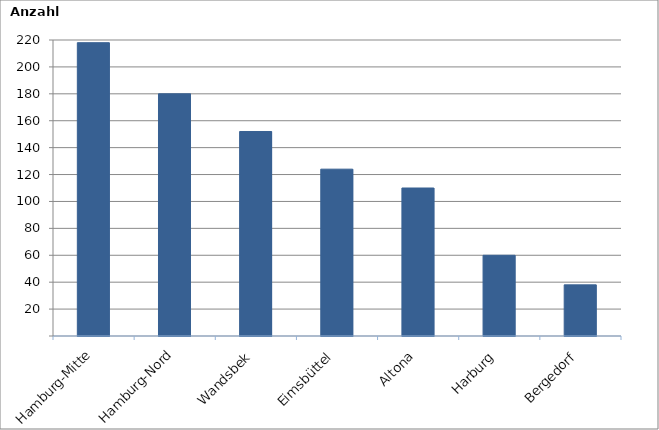
| Category | Series 0 |
|---|---|
| Hamburg-Mitte | 218 |
| Hamburg-Nord | 180 |
| Wandsbek | 152 |
| Eimsbüttel | 124 |
| Altona | 110 |
| Harburg | 60 |
| Bergedorf | 38 |